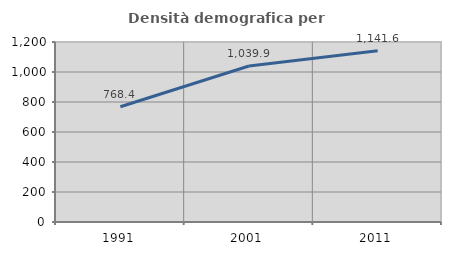
| Category | Densità demografica |
|---|---|
| 1991.0 | 768.376 |
| 2001.0 | 1039.884 |
| 2011.0 | 1141.616 |